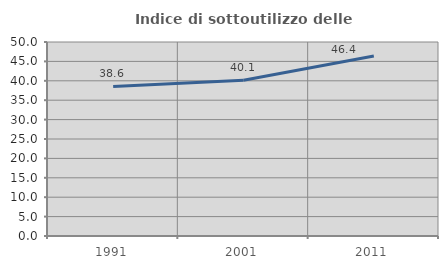
| Category | Indice di sottoutilizzo delle abitazioni  |
|---|---|
| 1991.0 | 38.56 |
| 2001.0 | 40.136 |
| 2011.0 | 46.38 |